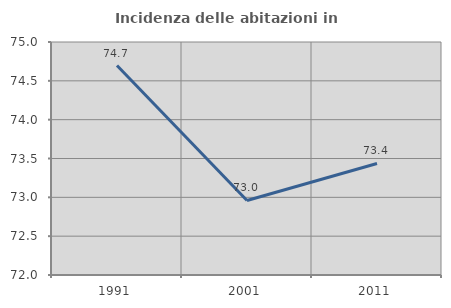
| Category | Incidenza delle abitazioni in proprietà  |
|---|---|
| 1991.0 | 74.697 |
| 2001.0 | 72.96 |
| 2011.0 | 73.436 |